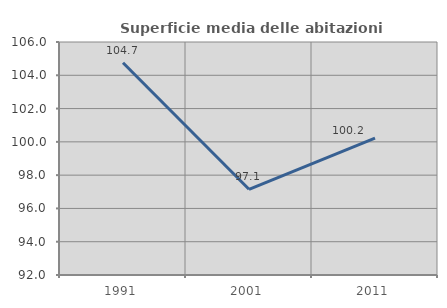
| Category | Superficie media delle abitazioni occupate |
|---|---|
| 1991.0 | 104.75 |
| 2001.0 | 97.149 |
| 2011.0 | 100.226 |